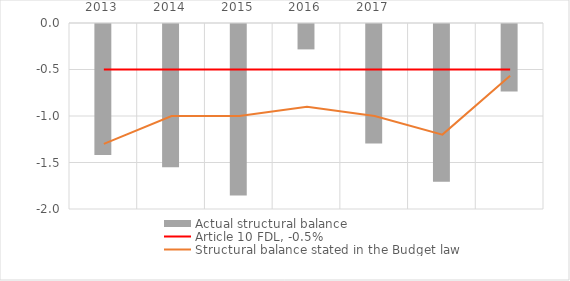
| Category | Actual structural balance |
|---|---|
| 2013.0 | -1.409 |
| 2014.0 | -1.542 |
| 2015.0 | -1.845 |
| 2016.0 | -0.273 |
| 2017.0 | -1.286 |